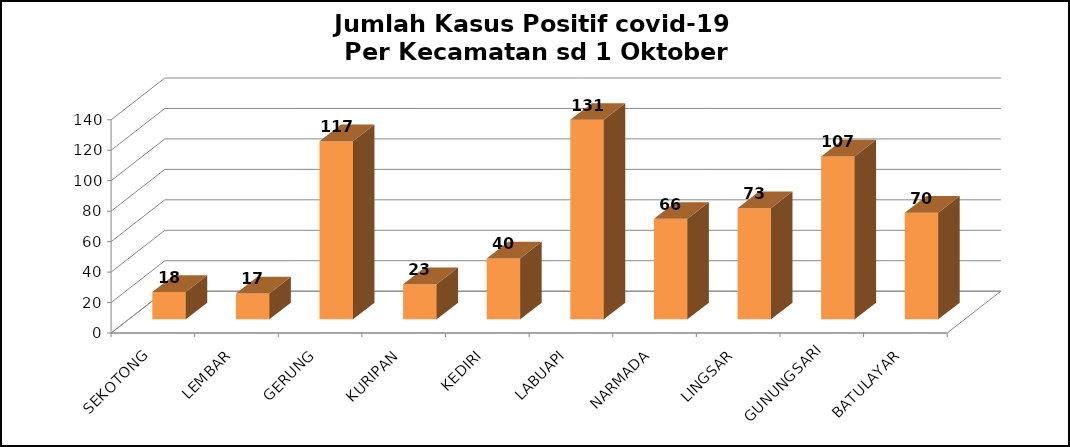
| Category | Series 0 |
|---|---|
| SEKOTONG | 18 |
| LEMBAR | 17 |
| GERUNG | 117 |
| KURIPAN | 23 |
| KEDIRI | 40 |
| LABUAPI | 131 |
| NARMADA | 66 |
| LINGSAR | 73 |
| GUNUNGSARI | 107 |
| BATULAYAR | 70 |